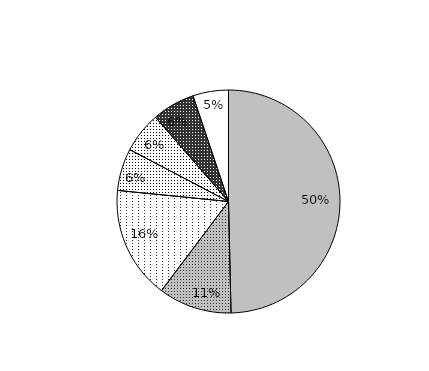
| Category | Series 0 | Data C |
|---|---|---|
| 0 | 83.586 | 0 |
| 1 | 17.883 | 0 |
| 2 | 27.496 | 0 |
| 3 | 10.287 | 0 |
| 4 | 10.011 | 0 |
| 5 | 10.436 | 0 |
| 6 | 8.694 | 0 |